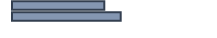
| Category | Series 0 |
|---|---|
| 0 | 45.921 |
| 1 | 54.079 |